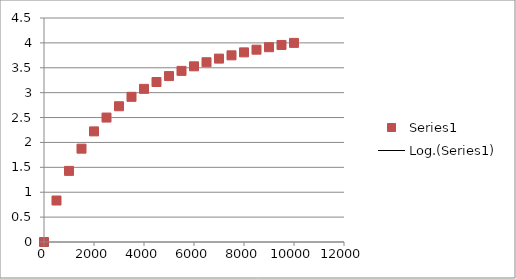
| Category | Series 1 |
|---|---|
| 0.0 | 0 |
| 500.0 | 0.833 |
| 1000.0 | 1.429 |
| 1500.0 | 1.875 |
| 2000.0 | 2.222 |
| 2500.0 | 2.5 |
| 3000.0 | 2.727 |
| 3500.0 | 2.917 |
| 4000.0 | 3.077 |
| 4500.0 | 3.214 |
| 5000.0 | 3.333 |
| 5500.0 | 3.438 |
| 6000.0 | 3.529 |
| 6500.0 | 3.611 |
| 7000.0 | 3.684 |
| 7500.0 | 3.75 |
| 8000.0 | 3.81 |
| 8500.0 | 3.864 |
| 9000.0 | 3.913 |
| 9500.0 | 3.958 |
| 10000.0 | 4 |